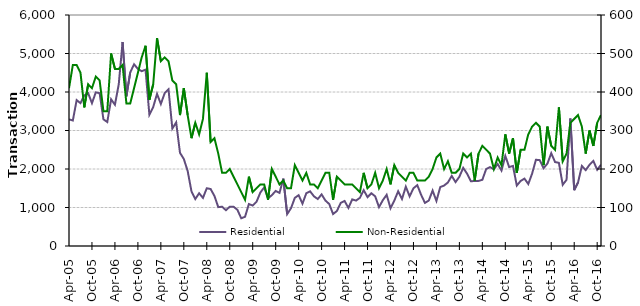
| Category | Residential |
|---|---|
| 2005-04-01 | 3290 |
| 2005-05-01 | 3260 |
| 2005-06-01 | 3790 |
| 2005-07-01 | 3710 |
| 2005-08-01 | 3910 |
| 2005-09-01 | 3970 |
| 2005-10-01 | 3710 |
| 2005-11-01 | 3990 |
| 2005-12-01 | 3970 |
| 2006-01-01 | 3290 |
| 2006-02-01 | 3220 |
| 2006-03-01 | 3810 |
| 2006-04-01 | 3670 |
| 2006-05-01 | 4200 |
| 2006-06-01 | 5300 |
| 2006-07-01 | 3890 |
| 2006-08-01 | 4510 |
| 2006-09-01 | 4720 |
| 2006-10-01 | 4600 |
| 2006-11-01 | 4540 |
| 2006-12-01 | 4580 |
| 2007-01-01 | 3410 |
| 2007-02-01 | 3610 |
| 2007-03-01 | 3950 |
| 2007-04-01 | 3690 |
| 2007-05-01 | 3970 |
| 2007-06-01 | 4070 |
| 2007-07-01 | 3050 |
| 2007-08-01 | 3210 |
| 2007-09-01 | 2420 |
| 2007-10-01 | 2260 |
| 2007-11-01 | 1950 |
| 2007-12-01 | 1420 |
| 2008-01-01 | 1220 |
| 2008-02-01 | 1370 |
| 2008-03-01 | 1250 |
| 2008-04-01 | 1500 |
| 2008-05-01 | 1480 |
| 2008-06-01 | 1300 |
| 2008-07-01 | 1010 |
| 2008-08-01 | 1020 |
| 2008-09-01 | 930 |
| 2008-10-01 | 1020 |
| 2008-11-01 | 1020 |
| 2008-12-01 | 940 |
| 2009-01-01 | 720 |
| 2009-02-01 | 760 |
| 2009-03-01 | 1090 |
| 2009-04-01 | 1050 |
| 2009-05-01 | 1150 |
| 2009-06-01 | 1390 |
| 2009-07-01 | 1520 |
| 2009-08-01 | 1240 |
| 2009-09-01 | 1320 |
| 2009-10-01 | 1430 |
| 2009-11-01 | 1380 |
| 2009-12-01 | 1750 |
| 2010-01-01 | 830 |
| 2010-02-01 | 980 |
| 2010-03-01 | 1250 |
| 2010-04-01 | 1320 |
| 2010-05-01 | 1100 |
| 2010-06-01 | 1370 |
| 2010-07-01 | 1420 |
| 2010-08-01 | 1290 |
| 2010-09-01 | 1220 |
| 2010-10-01 | 1340 |
| 2010-11-01 | 1180 |
| 2010-12-01 | 1090 |
| 2011-01-01 | 830 |
| 2011-02-01 | 910 |
| 2011-03-01 | 1120 |
| 2011-04-01 | 1170 |
| 2011-05-01 | 990 |
| 2011-06-01 | 1210 |
| 2011-07-01 | 1180 |
| 2011-08-01 | 1250 |
| 2011-09-01 | 1450 |
| 2011-10-01 | 1270 |
| 2011-11-01 | 1370 |
| 2011-12-01 | 1290 |
| 2012-01-01 | 1010 |
| 2012-02-01 | 1190 |
| 2012-03-01 | 1330 |
| 2012-04-01 | 980 |
| 2012-05-01 | 1180 |
| 2012-06-01 | 1420 |
| 2012-07-01 | 1220 |
| 2012-08-01 | 1540 |
| 2012-09-01 | 1290 |
| 2012-10-01 | 1500 |
| 2012-11-01 | 1580 |
| 2012-12-01 | 1330 |
| 2013-01-01 | 1120 |
| 2013-02-01 | 1180 |
| 2013-03-01 | 1440 |
| 2013-04-01 | 1170 |
| 2013-05-01 | 1530 |
| 2013-06-01 | 1570 |
| 2013-07-01 | 1650 |
| 2013-08-01 | 1820 |
| 2013-09-01 | 1660 |
| 2013-10-01 | 1800 |
| 2013-11-01 | 2030 |
| 2013-12-01 | 1880 |
| 2014-01-01 | 1680 |
| 2014-02-01 | 1690 |
| 2014-03-01 | 1690 |
| 2014-04-01 | 1720 |
| 2014-05-01 | 2000 |
| 2014-06-01 | 2050 |
| 2014-07-01 | 1990 |
| 2014-08-01 | 2130 |
| 2014-09-01 | 1960 |
| 2014-10-01 | 2340 |
| 2014-11-01 | 2050 |
| 2014-12-01 | 2080 |
| 2015-01-01 | 1570 |
| 2015-02-01 | 1690 |
| 2015-03-01 | 1750 |
| 2015-04-01 | 1610 |
| 2015-05-01 | 1880 |
| 2015-06-01 | 2240 |
| 2015-07-01 | 2230 |
| 2015-08-01 | 2020 |
| 2015-09-01 | 2140 |
| 2015-10-01 | 2410 |
| 2015-11-01 | 2180 |
| 2015-12-01 | 2160 |
| 2016-01-01 | 1590 |
| 2016-02-01 | 1720 |
| 2016-03-01 | 3310 |
| 2016-04-01 | 1450 |
| 2016-05-01 | 1650 |
| 2016-06-01 | 2080 |
| 2016-07-01 | 1970 |
| 2016-08-01 | 2110 |
| 2016-09-01 | 2210 |
| 2016-10-01 | 1980 |
| 2016-11-01 | 2110 |